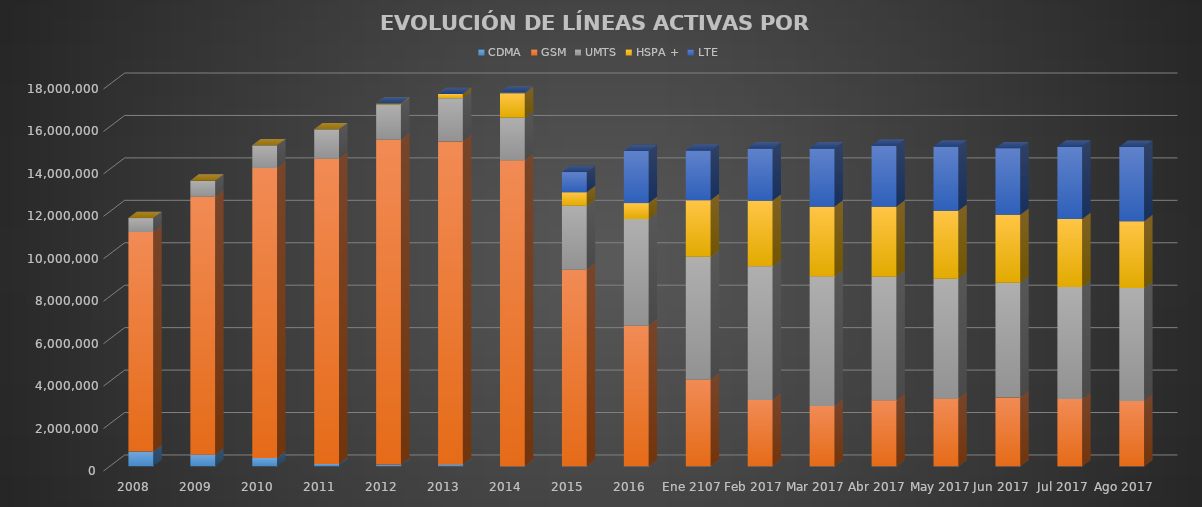
| Category | CDMA | GSM | UMTS | HSPA + | LTE |
|---|---|---|---|---|---|
| 2008 | 688357 | 10346902 | 656989 | 0 | 0 |
| 2009 | 544313 | 12151710 | 758577 | 0 | 0 |
| 2010 | 389834 | 13657394 | 1071603 | 0 | 0 |
| 2011 | 102115 | 14379423 | 1393020 | 0 | 0 |
| 2012 | 75179 | 15310006 | 1658596 | 43082 | 0 |
| 2013 | 83748 | 15215287 | 2043321 | 199398 | 0 |
| 2014 | 3009 | 14418144 | 2006405 | 1148823 | 28176 |
| 2015 | 0 | 9252920 | 3019889 | 636488 | 949723 |
| 2016 | 0 | 6621574 | 5027714 | 748032 | 2450814 |
| Ene 2107 | 0 | 4077503.931 | 5791273 | 2666950 | 2337499 |
| Feb 2017 | 0 | 3113374 | 6306926 | 3083549 | 2465632 |
| Mar 2017 | 0 | 2835527 | 6108473 | 3286428 | 2740639 |
| Abr 2017 | 0 | 3104390 | 5824513 | 3296921 | 2878643 |
| May 2017 | 0 | 3192252 | 5635221 | 3207620 | 3026765 |
| Jun 2017 | 0 | 3237012 | 5410989 | 3195204 | 3133566 |
| Jul 2017 | 0 | 3171665 | 5272378 | 3200717 | 3410480 |
| Ago 2017 | 0 | 3077260 | 5317796 | 3149750 | 3505191 |